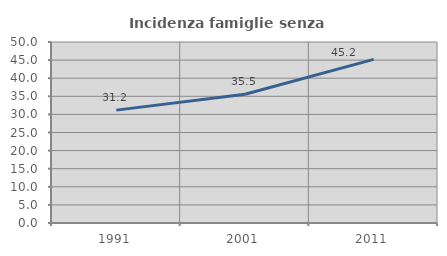
| Category | Incidenza famiglie senza nuclei |
|---|---|
| 1991.0 | 31.183 |
| 2001.0 | 35.55 |
| 2011.0 | 45.204 |